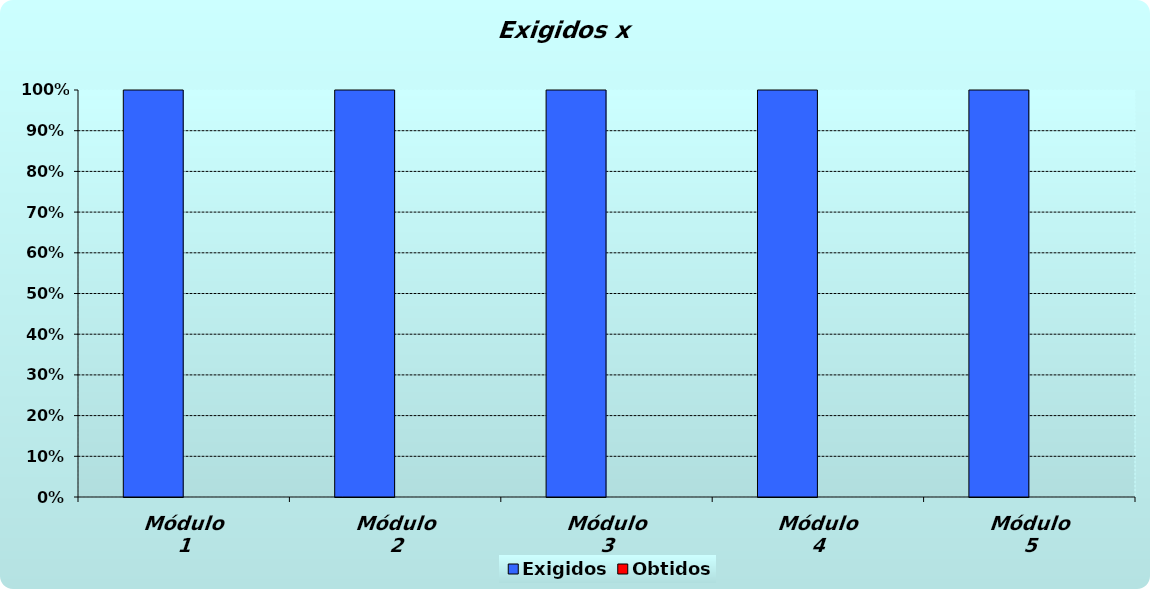
| Category | Exigidos | Obtidos |
|---|---|---|
| Módulo 1 | 1 | 0 |
| Módulo 2 | 1 | 0 |
| Módulo 3 | 1 | 0 |
| Módulo 4 | 1 | 0 |
| Módulo 5 | 1 | 0 |